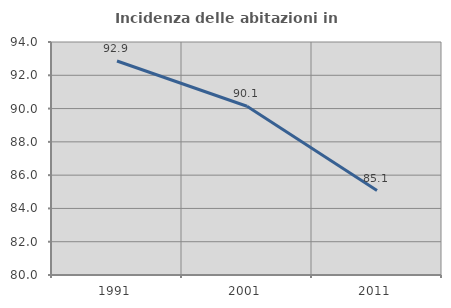
| Category | Incidenza delle abitazioni in proprietà  |
|---|---|
| 1991.0 | 92.857 |
| 2001.0 | 90.141 |
| 2011.0 | 85.075 |